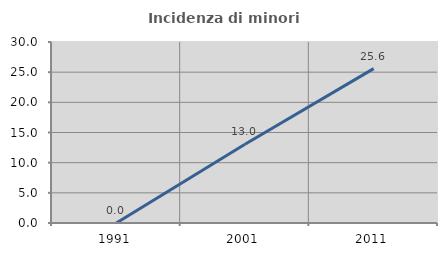
| Category | Incidenza di minori stranieri |
|---|---|
| 1991.0 | 0 |
| 2001.0 | 13.043 |
| 2011.0 | 25.581 |